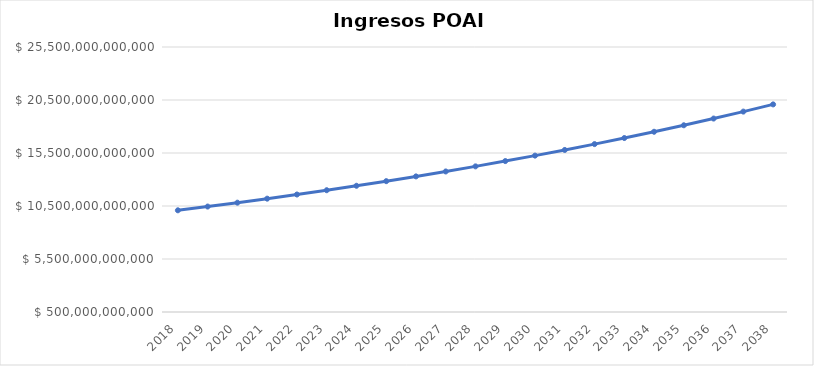
| Category | INGRESOS POAI |
|---|---|
| 2018.0 | 10094361014000 |
| 2019.0 | 10447663649490 |
| 2020.0 | 10813331877222.148 |
| 2021.0 | 11191798492924.922 |
| 2022.0 | 11583511440177.293 |
| 2023.0 | 11988934340583.498 |
| 2024.0 | 12408547042503.92 |
| 2025.0 | 12842846188991.557 |
| 2026.0 | 13292345805606.26 |
| 2027.0 | 13757577908802.479 |
| 2028.0 | 14239093135610.564 |
| 2029.0 | 14737461395356.934 |
| 2030.0 | 15253272544194.426 |
| 2031.0 | 15787137083241.229 |
| 2032.0 | 16339686881154.67 |
| 2033.0 | 16911575921995.082 |
| 2034.0 | 17503481079264.908 |
| 2035.0 | 18116102917039.18 |
| 2036.0 | 18750166519135.55 |
| 2037.0 | 19406422347305.293 |
| 2038.0 | 20085647129460.977 |